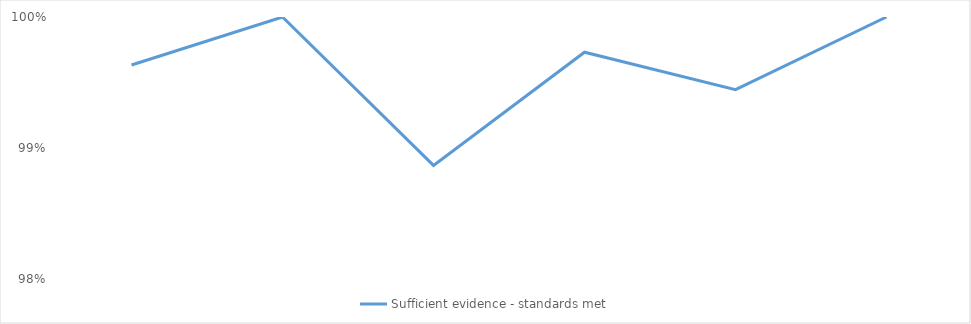
| Category | Sufficient evidence - standards met |
|---|---|
| 0 | 0.996 |
| 1 | 1 |
| 2 | 0.989 |
| 3 | 0.997 |
| 4 | 0.994 |
| 5 | 1 |